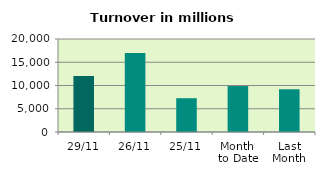
| Category | Series 0 |
|---|---|
| 29/11 | 12022.048 |
| 26/11 | 17011.311 |
| 25/11 | 7262.248 |
| Month 
to Date | 9887.384 |
| Last
Month | 9192.028 |